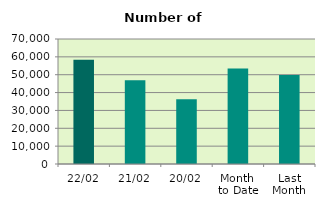
| Category | Series 0 |
|---|---|
| 22/02 | 58344 |
| 21/02 | 46904 |
| 20/02 | 36226 |
| Month 
to Date | 53517.25 |
| Last
Month | 49894.952 |